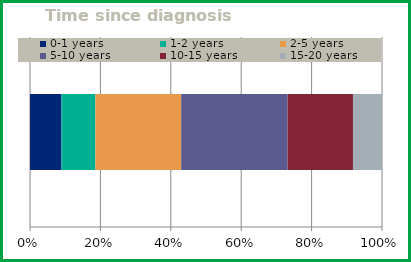
| Category | 0-1 years | 1-2 years | 2-5 years | 5-10 years | 10-15 years | 15-20 years |
|---|---|---|---|---|---|---|
| 0 | 26 | 28 | 71 | 88 | 54 | 24 |